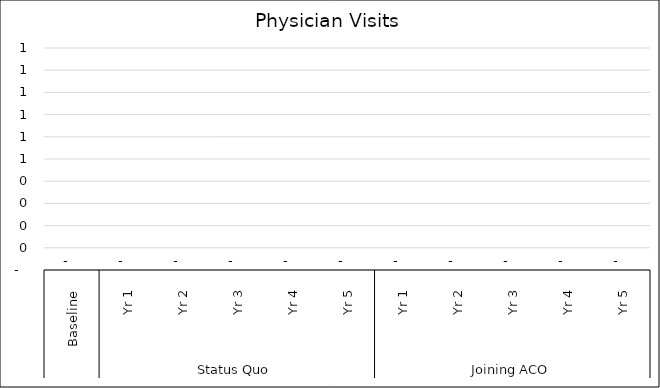
| Category | Physician Visits |
|---|---|
| 0 | 0 |
| 1 | 0 |
| 2 | 0 |
| 3 | 0 |
| 4 | 0 |
| 5 | 0 |
| 6 | 0 |
| 7 | 0 |
| 8 | 0 |
| 9 | 0 |
| 10 | 0 |